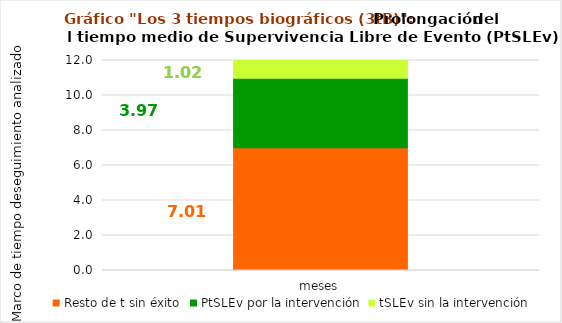
| Category | Resto de t sin éxito | PtSLEv por la intervención | tSLEv sin la intervención |
|---|---|---|---|
| meses | 7.013 | 3.972 | 1.015 |